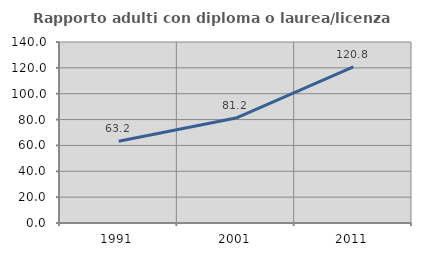
| Category | Rapporto adulti con diploma o laurea/licenza media  |
|---|---|
| 1991.0 | 63.198 |
| 2001.0 | 81.199 |
| 2011.0 | 120.842 |